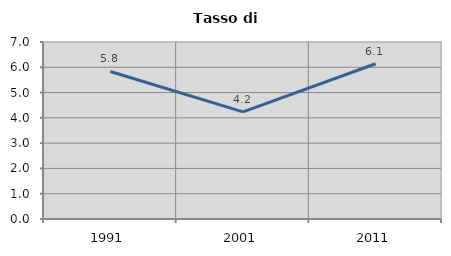
| Category | Tasso di disoccupazione   |
|---|---|
| 1991.0 | 5.834 |
| 2001.0 | 4.236 |
| 2011.0 | 6.14 |